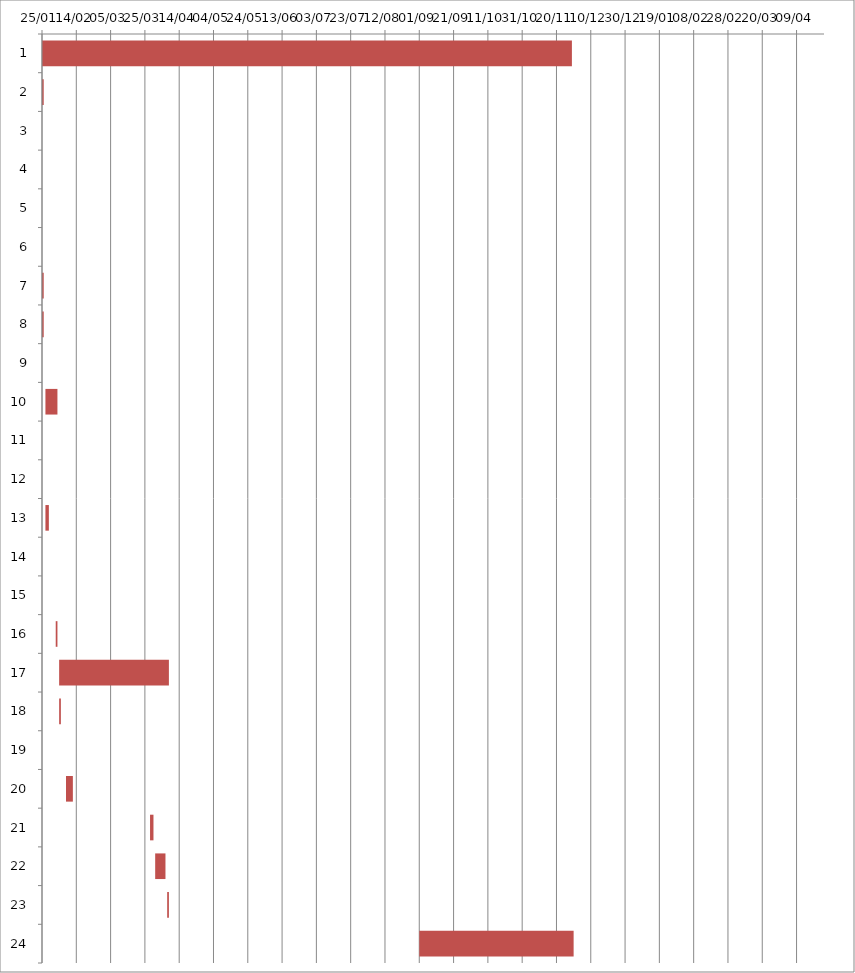
| Category | Fecha de inicio | DURACIÓN |
|---|---|---|
| 0 | 1/25/16 | 309 |
| 1 | 1/25/16 | 1 |
| 2 | 1/25/16 | 0 |
| 3 | 1/25/16 | 0 |
| 4 | 1/25/16 | 0 |
| 5 | 1/25/16 | 0 |
| 6 | 1/25/16 | 1 |
| 7 | 1/25/16 | 1 |
| 8 | 1/26/16 | 0 |
| 9 | 1/27/16 | 7 |
| 10 | 1/27/16 | 0 |
| 11 | 1/28/16 | 0 |
| 12 | 1/27/16 | 2 |
| 13 | 2/1/16 | 0 |
| 14 | 2/2/16 | 0 |
| 15 | 2/2/16 | 1 |
| 16 | 2/4/16 | 64 |
| 17 | 2/4/16 | 1 |
| 18 | 2/5/16 | 0 |
| 19 | 2/8/16 | 4 |
| 20 | 3/28/16 | 2 |
| 21 | 3/31/16 | 6 |
| 22 | 4/7/16 | 1 |
| 23 | 9/1/16 | 90 |